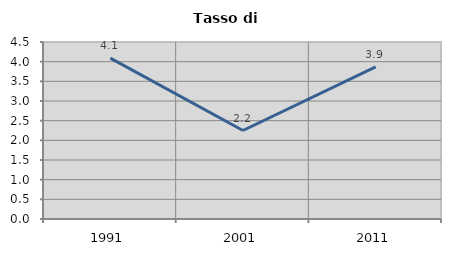
| Category | Tasso di disoccupazione   |
|---|---|
| 1991.0 | 4.089 |
| 2001.0 | 2.249 |
| 2011.0 | 3.867 |